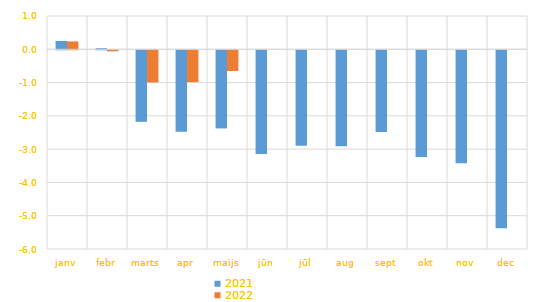
| Category | 2021 | 2022 |
|---|---|---|
| janv | 0.251 | 0.236 |
| febr | 0.033 | -0.031 |
| marts | -2.15 | -0.966 |
| apr | -2.448 | -0.954 |
| maijs | -2.348 | -0.622 |
| jūn | -3.115 | 0 |
| jūl | -2.871 | 0 |
| aug | -2.883 | 0 |
| sept | -2.456 | 0 |
| okt | -3.204 | 0 |
| nov | -3.393 | 0 |
| dec | -5.348 | 0 |